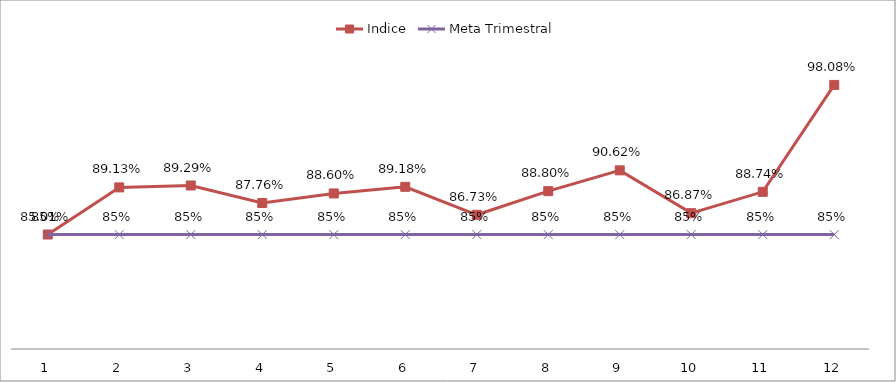
| Category | Indice | Meta Trimestral |
|---|---|---|
| 0 | 0.85 | 0.85 |
| 1 | 0.891 | 0.85 |
| 2 | 0.893 | 0.85 |
| 3 | 0.878 | 0.85 |
| 4 | 0.886 | 0.85 |
| 5 | 0.892 | 0.85 |
| 6 | 0.867 | 0.85 |
| 7 | 0.888 | 0.85 |
| 8 | 0.906 | 0.85 |
| 9 | 0.869 | 0.85 |
| 10 | 0.887 | 0.85 |
| 11 | 0.981 | 0.85 |